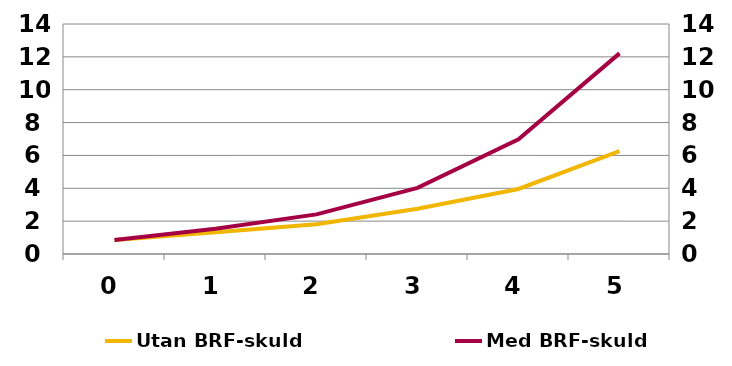
| Category | Utan BRF-skuld |
|---|---|
| 0.0 | 0.847 |
| 1.0 | 1.319 |
| 2.0 | 1.808 |
| 3.0 | 2.752 |
| 4.0 | 3.957 |
| 5.0 | 6.269 |